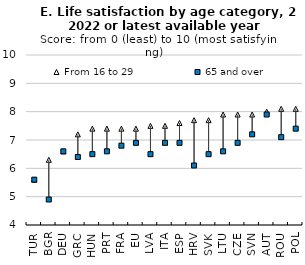
| Category | From 16 to 29 | 65 and over |
|---|---|---|
| TUR | 5.6 | 5.6 |
| BGR | 6.3 | 4.9 |
| DEU | 6.6 | 6.6 |
| GRC | 7.2 | 6.4 |
| HUN | 7.4 | 6.5 |
| PRT | 7.4 | 6.6 |
| FRA | 7.4 | 6.8 |
| EU | 7.4 | 6.9 |
| LVA | 7.5 | 6.5 |
| ITA | 7.5 | 6.9 |
| ESP | 7.6 | 6.9 |
| HRV | 7.7 | 6.1 |
| SVK | 7.7 | 6.5 |
| LTU | 7.9 | 6.6 |
| CZE | 7.9 | 6.9 |
| SVN | 7.9 | 7.2 |
| AUT | 8 | 7.9 |
| ROU | 8.1 | 7.1 |
| POL | 8.1 | 7.4 |